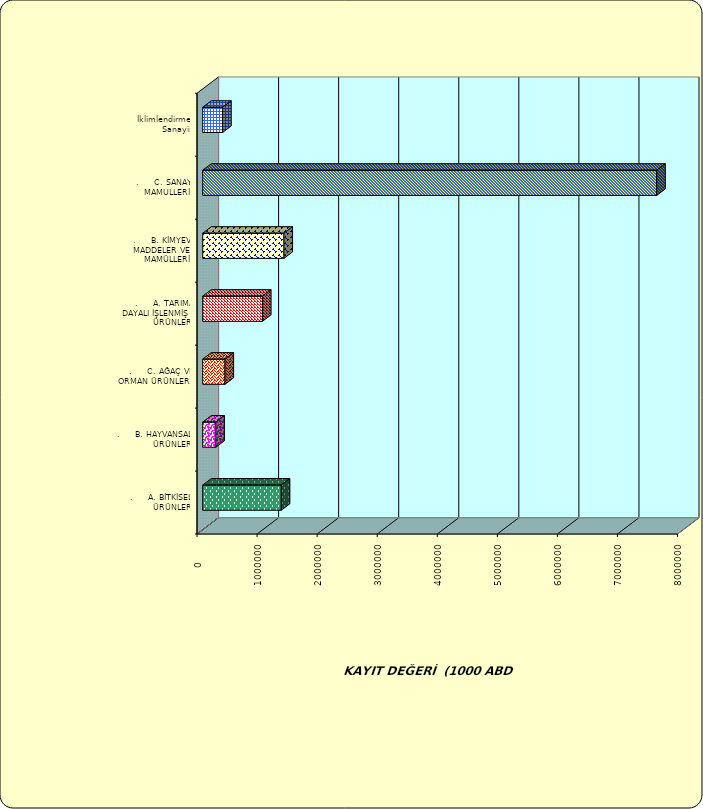
| Category | Series 0 |
|---|---|
| .     A. BİTKİSEL ÜRÜNLER | 1308151.475 |
| .     B. HAYVANSAL ÜRÜNLER | 218448.596 |
| .     C. AĞAÇ VE ORMAN ÜRÜNLERİ | 371528.796 |
| .     A. TARIMA DAYALI İŞLENMİŞ ÜRÜNLER | 995238.008 |
| .     B. KİMYEVİ MADDELER VE MAMÜLLERİ | 1353176.81 |
| .     C. SANAYİ MAMULLERİ | 7559955.721 |
|  İklimlendirme Sanayii | 331808.356 |